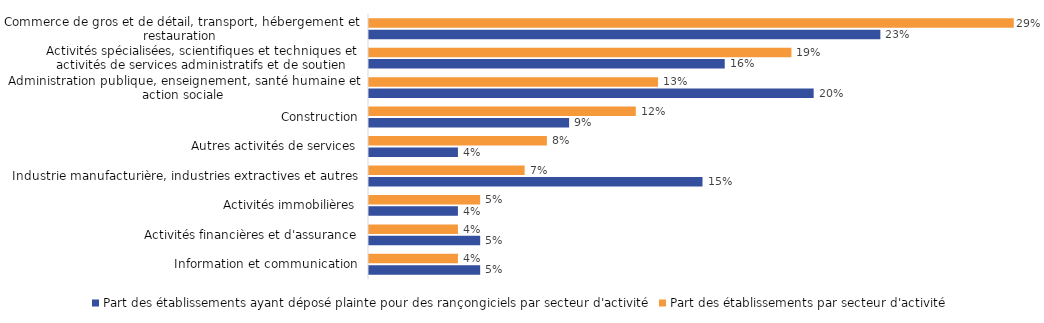
| Category | Part des établissements ayant déposé plainte pour des rançongiciels par secteur d'activité | Part des établissements par secteur d'activité |
|---|---|---|
| Information et communication | 0.05 | 0.04 |
| Activités financières et d'assurance | 0.05 | 0.04 |
| Activités immobilières | 0.04 | 0.05 |
| Industrie manufacturière, industries extractives et autres | 0.15 | 0.07 |
| Autres activités de services | 0.04 | 0.08 |
| Construction | 0.09 | 0.12 |
| Administration publique, enseignement, santé humaine et action sociale | 0.2 | 0.13 |
| Activités spécialisées, scientifiques et techniques et activités de services administratifs et de soutien | 0.16 | 0.19 |
| Commerce de gros et de détail, transport, hébergement et restauration  | 0.23 | 0.29 |